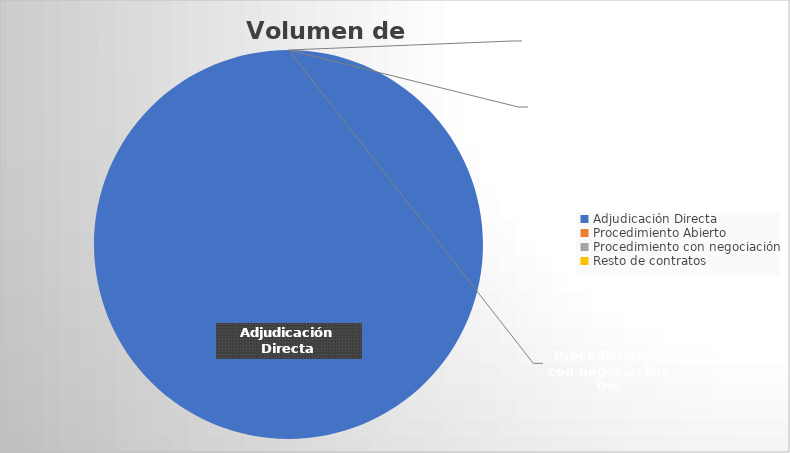
| Category | Adjudicación Directa |
|---|---|
| Adjudicación Directa | 5008.84 |
| Procedimiento Abierto | 0 |
| Procedimiento con negociación | 0 |
| Resto de contratos | 0 |